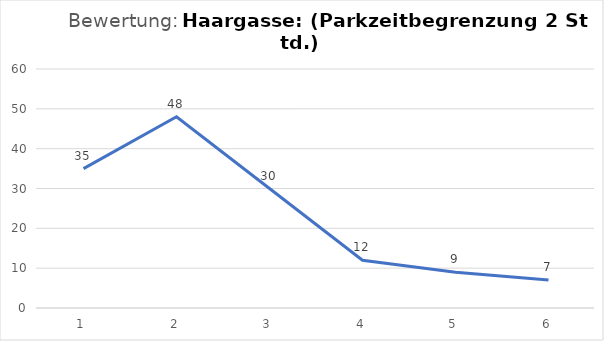
| Category | Series 0 |
|---|---|
| 1.0 | 35 |
| 2.0 | 48 |
| 3.0 | 30 |
| 4.0 | 12 |
| 5.0 | 9 |
| 6.0 | 7 |